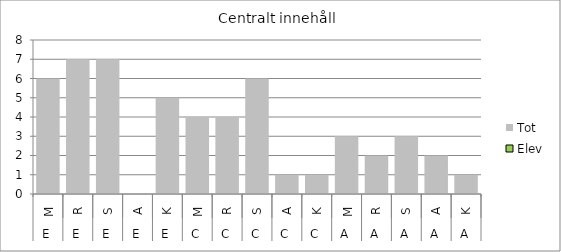
| Category | Tot | Elev |
|---|---|---|
| 0 | 6 | 0 |
| 1 | 7 | 0 |
| 2 | 7 | 0 |
| 3 | 0 | 0 |
| 4 | 5 | 0 |
| 5 | 4 | 0 |
| 6 | 4 | 0 |
| 7 | 6 | 0 |
| 8 | 1 | 0 |
| 9 | 1 | 0 |
| 10 | 3 | 0 |
| 11 | 2 | 0 |
| 12 | 3 | 0 |
| 13 | 2 | 0 |
| 14 | 1 | 0 |